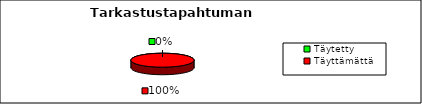
| Category | Tarkastustapahtuman eteneminen |
|---|---|
| Täytetty | 0 |
| Täyttämättä | 41 |